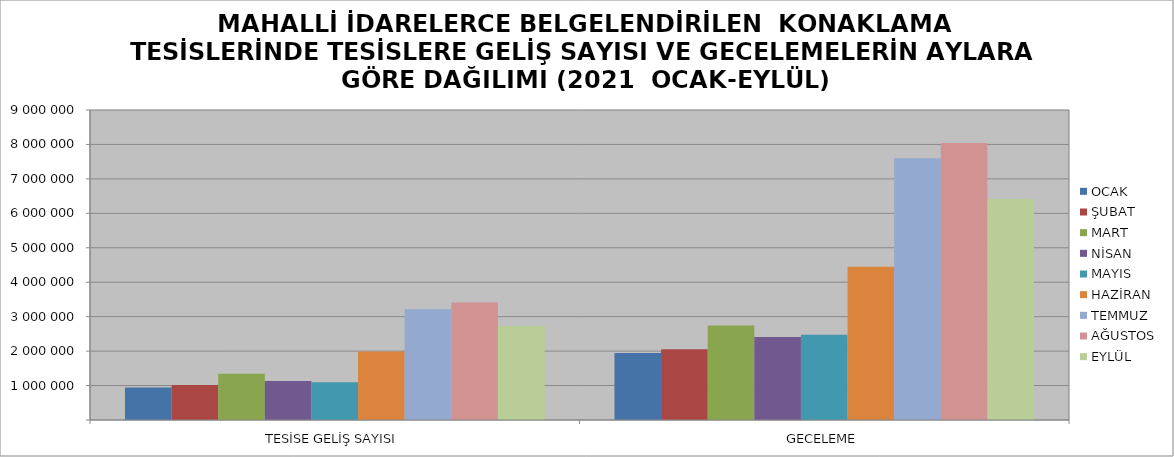
| Category | OCAK | ŞUBAT | MART | NİSAN | MAYIS | HAZİRAN | TEMMUZ | AĞUSTOS | EYLÜL |
|---|---|---|---|---|---|---|---|---|---|
| TESİSE GELİŞ SAYISI | 940331 | 1017199 | 1342202 | 1131069 | 1098456 | 1989433 | 3215014 | 3414690 | 2728285 |
| GECELEME | 1943007 | 2056594 | 2743257 | 2406723 | 2471826 | 4450821 | 7597288 | 8039529 | 6417353 |